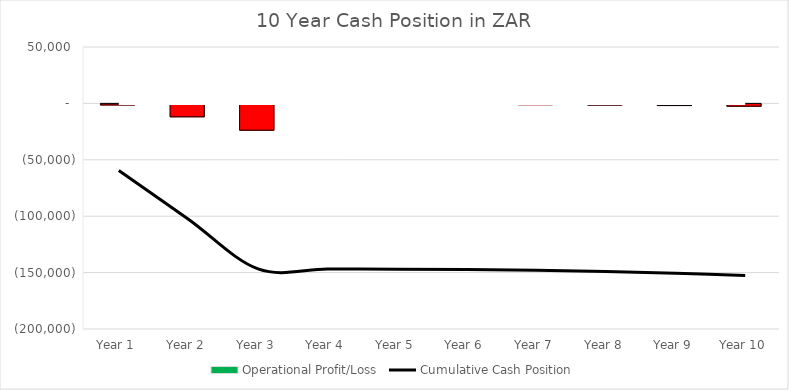
| Category | Operational Profit/Loss |
|---|---|
| 0 | -944.87 |
| 1 | -11488.088 |
| 2 | -23332.571 |
| 3 | -142.922 |
| 4 | -61.738 |
| 5 | -365.799 |
| 6 | -659.357 |
| 7 | -1077.611 |
| 8 | -1493.509 |
| 9 | -2051.181 |